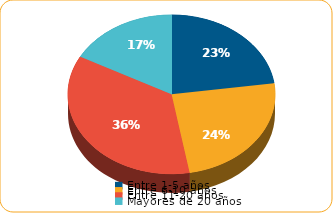
| Category | Series 0 |
|---|---|
| Entre 1-5 años | 2884.6 |
| Entre 6-10 años | 3100.8 |
| Entre 11-20 años | 4520 |
| Mayores de 20 años | 2173.9 |